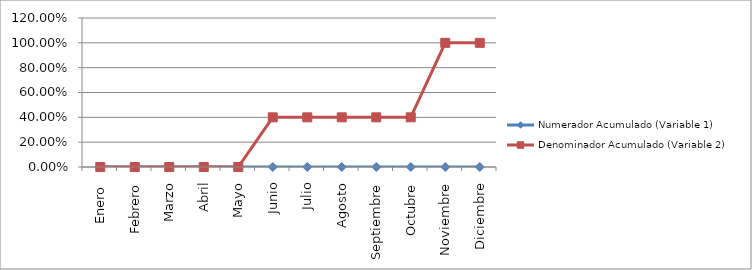
| Category | Numerador Acumulado (Variable 1) | Denominador Acumulado (Variable 2) |
|---|---|---|
| Enero  | 0 | 0 |
| Febrero | 0 | 0 |
| Marzo | 0 | 0 |
| Abril | 0 | 0 |
| Mayo | 0 | 0 |
| Junio | 0 | 0.4 |
| Julio | 0 | 0.4 |
| Agosto | 0 | 0.4 |
| Septiembre | 0 | 0.4 |
| Octubre | 0 | 0.4 |
| Noviembre | 0 | 1 |
| Diciembre | 0 | 1 |